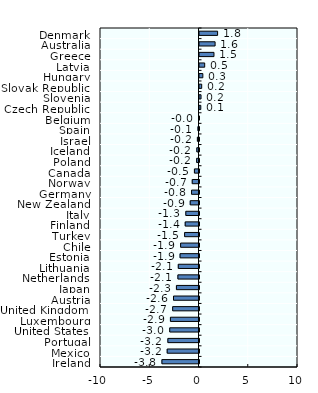
| Category | Equity |
|---|---|
| Denmark | 1.837 |
| Australia | 1.584 |
| Greece | 1.469 |
| Latvia | 0.528 |
| Hungary | 0.34 |
| Slovak Republic | 0.223 |
| Slovenia | 0.157 |
| Czech Republic | 0.132 |
| Belgium | -0.03 |
| Spain | -0.107 |
| Israel | -0.162 |
| Iceland | -0.221 |
| Poland | -0.239 |
| Canada | -0.464 |
| Norway | -0.686 |
| Germany | -0.756 |
| New Zealand | -0.891 |
| Italy | -1.338 |
| Finland | -1.4 |
| Turkey | -1.46 |
| Chile | -1.867 |
| Estonia | -1.923 |
| Lithuania | -2.103 |
| Netherlands | -2.142 |
| Japan | -2.291 |
| Austria | -2.589 |
| United Kingdom | -2.674 |
| Luxembourg | -2.901 |
| United States | -2.972 |
| Portugal | -3.16 |
| Mexico | -3.229 |
| Ireland | -3.764 |